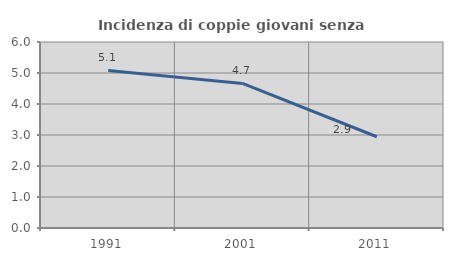
| Category | Incidenza di coppie giovani senza figli |
|---|---|
| 1991.0 | 5.083 |
| 2001.0 | 4.663 |
| 2011.0 | 2.944 |